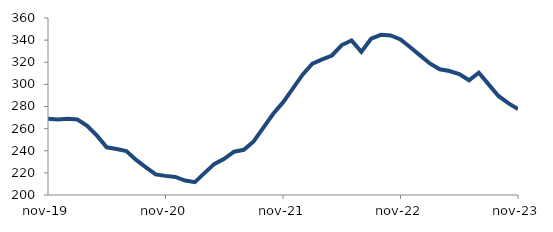
| Category | Series 0 |
|---|---|
| 2019-11-01 | 268.873 |
| 2019-12-01 | 268.319 |
| 2020-01-01 | 268.914 |
| 2020-02-01 | 268.233 |
| 2020-03-01 | 262.58 |
| 2020-04-01 | 253.663 |
| 2020-05-01 | 243.088 |
| 2020-06-01 | 241.541 |
| 2020-07-01 | 239.786 |
| 2020-08-01 | 231.766 |
| 2020-09-01 | 225.047 |
| 2020-10-01 | 218.571 |
| 2020-11-01 | 217.286 |
| 2020-12-01 | 216.368 |
| 2021-01-01 | 213.087 |
| 2021-02-01 | 211.643 |
| 2021-03-01 | 220.04 |
| 2021-04-01 | 228.12 |
| 2021-05-01 | 232.717 |
| 2021-06-01 | 239.097 |
| 2021-07-01 | 240.846 |
| 2021-08-01 | 248.449 |
| 2021-09-01 | 260.934 |
| 2021-10-01 | 273.441 |
| 2021-11-01 | 283.683 |
| 2021-12-01 | 296.134 |
| 2022-01-01 | 308.804 |
| 2022-02-01 | 318.726 |
| 2022-03-01 | 322.592 |
| 2022-04-01 | 326.114 |
| 2022-05-01 | 335.557 |
| 2022-06-01 | 339.684 |
| 2022-07-01 | 329.357 |
| 2022-08-01 | 341.293 |
| 2022-09-01 | 344.793 |
| 2022-10-01 | 344.185 |
| 2022-11-01 | 340.608 |
| 2022-12-01 | 333.559 |
| 2023-01-01 | 326.199 |
| 2023-02-01 | 318.915 |
| 2023-03-01 | 313.615 |
| 2023-04-01 | 312.076 |
| 2023-05-01 | 309.232 |
| 2023-06-01 | 303.714 |
| 2023-07-01 | 310.493 |
| 2023-08-01 | 299.987 |
| 2023-09-01 | 289.543 |
| 2023-10-01 | 283.093 |
| 2023-11-01 | 277.645 |